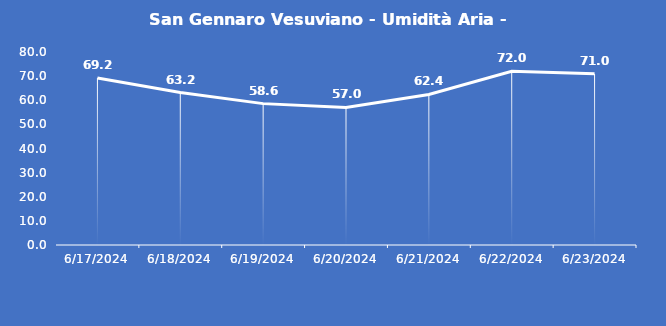
| Category | San Gennaro Vesuviano - Umidità Aria - Grezzo (%) |
|---|---|
| 6/17/24 | 69.2 |
| 6/18/24 | 63.2 |
| 6/19/24 | 58.6 |
| 6/20/24 | 57 |
| 6/21/24 | 62.4 |
| 6/22/24 | 72 |
| 6/23/24 | 71 |